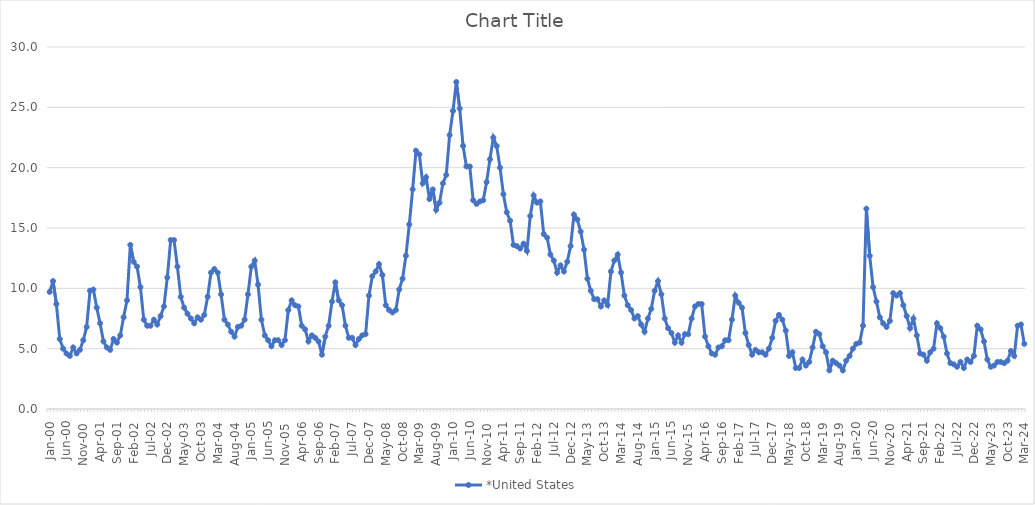
| Category | *United States | Alaska | Alabama | Arkansas | Arizona | California | Colorado | Connecticut | Delaware | Florida | Georgia | Hawaii | Iowa | Idaho | Illinois | Indiana | Kansas | Kentucky | Louisiana | Massachusetts | Maryland | Maine | Michigan | Minnesota | Missouri | Mississippi | Montana | North Carolina | North Dakota | Nebraska | New Hampshire | New Jersey | New Mexico | Nevada | New York | Ohio | Oklahoma | Oregon | Pennsylvania | Rhode Island | South Carolina | South Dakota | Tennessee | Texas | Utah | Virginia | Vermont | Washington | Wisconsin | West Virginia | Wyoming |
|---|---|---|---|---|---|---|---|---|---|---|---|---|---|---|---|---|---|---|---|---|---|---|---|---|---|---|---|---|---|---|---|---|---|---|---|---|---|---|---|---|---|---|---|---|---|---|---|---|---|---|---|
| Jan-00 | 9.7 |  |  |  |  |  |  |  |  |  |  |  |  |  |  |  |  |  |  |  |  |  |  |  |  |  |  |  |  |  |  |  |  |  |  |  |  |  |  |  |  |  |  |  |  |  |  |  |  |  |  |
| Feb-00 | 10.6 |  |  |  |  |  |  |  |  |  |  |  |  |  |  |  |  |  |  |  |  |  |  |  |  |  |  |  |  |  |  |  |  |  |  |  |  |  |  |  |  |  |  |  |  |  |  |  |  |  |  |
| Mar-00 | 8.7 |  |  |  |  |  |  |  |  |  |  |  |  |  |  |  |  |  |  |  |  |  |  |  |  |  |  |  |  |  |  |  |  |  |  |  |  |  |  |  |  |  |  |  |  |  |  |  |  |  |  |
| Apr-00 | 5.8 |  |  |  |  |  |  |  |  |  |  |  |  |  |  |  |  |  |  |  |  |  |  |  |  |  |  |  |  |  |  |  |  |  |  |  |  |  |  |  |  |  |  |  |  |  |  |  |  |  |  |
| May-00 | 5 |  |  |  |  |  |  |  |  |  |  |  |  |  |  |  |  |  |  |  |  |  |  |  |  |  |  |  |  |  |  |  |  |  |  |  |  |  |  |  |  |  |  |  |  |  |  |  |  |  |  |
| Jun-00 | 4.6 |  |  |  |  |  |  |  |  |  |  |  |  |  |  |  |  |  |  |  |  |  |  |  |  |  |  |  |  |  |  |  |  |  |  |  |  |  |  |  |  |  |  |  |  |  |  |  |  |  |  |
| Jul-00 | 4.4 |  |  |  |  |  |  |  |  |  |  |  |  |  |  |  |  |  |  |  |  |  |  |  |  |  |  |  |  |  |  |  |  |  |  |  |  |  |  |  |  |  |  |  |  |  |  |  |  |  |  |
| Aug-00 | 5.1 |  |  |  |  |  |  |  |  |  |  |  |  |  |  |  |  |  |  |  |  |  |  |  |  |  |  |  |  |  |  |  |  |  |  |  |  |  |  |  |  |  |  |  |  |  |  |  |  |  |  |
| Sep-00 | 4.6 |  |  |  |  |  |  |  |  |  |  |  |  |  |  |  |  |  |  |  |  |  |  |  |  |  |  |  |  |  |  |  |  |  |  |  |  |  |  |  |  |  |  |  |  |  |  |  |  |  |  |
| Oct-00 | 4.9 |  |  |  |  |  |  |  |  |  |  |  |  |  |  |  |  |  |  |  |  |  |  |  |  |  |  |  |  |  |  |  |  |  |  |  |  |  |  |  |  |  |  |  |  |  |  |  |  |  |  |
| Nov-00 | 5.7 |  |  |  |  |  |  |  |  |  |  |  |  |  |  |  |  |  |  |  |  |  |  |  |  |  |  |  |  |  |  |  |  |  |  |  |  |  |  |  |  |  |  |  |  |  |  |  |  |  |  |
| Dec-00 | 6.8 |  |  |  |  |  |  |  |  |  |  |  |  |  |  |  |  |  |  |  |  |  |  |  |  |  |  |  |  |  |  |  |  |  |  |  |  |  |  |  |  |  |  |  |  |  |  |  |  |  |  |
| Jan-01 | 9.8 |  |  |  |  |  |  |  |  |  |  |  |  |  |  |  |  |  |  |  |  |  |  |  |  |  |  |  |  |  |  |  |  |  |  |  |  |  |  |  |  |  |  |  |  |  |  |  |  |  |  |
| Feb-01 | 9.9 |  |  |  |  |  |  |  |  |  |  |  |  |  |  |  |  |  |  |  |  |  |  |  |  |  |  |  |  |  |  |  |  |  |  |  |  |  |  |  |  |  |  |  |  |  |  |  |  |  |  |
| Mar-01 | 8.4 |  |  |  |  |  |  |  |  |  |  |  |  |  |  |  |  |  |  |  |  |  |  |  |  |  |  |  |  |  |  |  |  |  |  |  |  |  |  |  |  |  |  |  |  |  |  |  |  |  |  |
| Apr-01 | 7.1 |  |  |  |  |  |  |  |  |  |  |  |  |  |  |  |  |  |  |  |  |  |  |  |  |  |  |  |  |  |  |  |  |  |  |  |  |  |  |  |  |  |  |  |  |  |  |  |  |  |  |
| May-01 | 5.6 |  |  |  |  |  |  |  |  |  |  |  |  |  |  |  |  |  |  |  |  |  |  |  |  |  |  |  |  |  |  |  |  |  |  |  |  |  |  |  |  |  |  |  |  |  |  |  |  |  |  |
| Jun-01 | 5.1 |  |  |  |  |  |  |  |  |  |  |  |  |  |  |  |  |  |  |  |  |  |  |  |  |  |  |  |  |  |  |  |  |  |  |  |  |  |  |  |  |  |  |  |  |  |  |  |  |  |  |
| Jul-01 | 4.9 |  |  |  |  |  |  |  |  |  |  |  |  |  |  |  |  |  |  |  |  |  |  |  |  |  |  |  |  |  |  |  |  |  |  |  |  |  |  |  |  |  |  |  |  |  |  |  |  |  |  |
| Aug-01 | 5.8 |  |  |  |  |  |  |  |  |  |  |  |  |  |  |  |  |  |  |  |  |  |  |  |  |  |  |  |  |  |  |  |  |  |  |  |  |  |  |  |  |  |  |  |  |  |  |  |  |  |  |
| Sep-01 | 5.5 |  |  |  |  |  |  |  |  |  |  |  |  |  |  |  |  |  |  |  |  |  |  |  |  |  |  |  |  |  |  |  |  |  |  |  |  |  |  |  |  |  |  |  |  |  |  |  |  |  |  |
| Oct-01 | 6.1 |  |  |  |  |  |  |  |  |  |  |  |  |  |  |  |  |  |  |  |  |  |  |  |  |  |  |  |  |  |  |  |  |  |  |  |  |  |  |  |  |  |  |  |  |  |  |  |  |  |  |
| Nov-01 | 7.6 |  |  |  |  |  |  |  |  |  |  |  |  |  |  |  |  |  |  |  |  |  |  |  |  |  |  |  |  |  |  |  |  |  |  |  |  |  |  |  |  |  |  |  |  |  |  |  |  |  |  |
| Dec-01 | 9 |  |  |  |  |  |  |  |  |  |  |  |  |  |  |  |  |  |  |  |  |  |  |  |  |  |  |  |  |  |  |  |  |  |  |  |  |  |  |  |  |  |  |  |  |  |  |  |  |  |  |
| Jan-02 | 13.6 |  |  |  |  |  |  |  |  |  |  |  |  |  |  |  |  |  |  |  |  |  |  |  |  |  |  |  |  |  |  |  |  |  |  |  |  |  |  |  |  |  |  |  |  |  |  |  |  |  |  |
| Feb-02 | 12.2 |  |  |  |  |  |  |  |  |  |  |  |  |  |  |  |  |  |  |  |  |  |  |  |  |  |  |  |  |  |  |  |  |  |  |  |  |  |  |  |  |  |  |  |  |  |  |  |  |  |  |
| Mar-02 | 11.8 |  |  |  |  |  |  |  |  |  |  |  |  |  |  |  |  |  |  |  |  |  |  |  |  |  |  |  |  |  |  |  |  |  |  |  |  |  |  |  |  |  |  |  |  |  |  |  |  |  |  |
| Apr-02 | 10.1 |  |  |  |  |  |  |  |  |  |  |  |  |  |  |  |  |  |  |  |  |  |  |  |  |  |  |  |  |  |  |  |  |  |  |  |  |  |  |  |  |  |  |  |  |  |  |  |  |  |  |
| May-02 | 7.4 |  |  |  |  |  |  |  |  |  |  |  |  |  |  |  |  |  |  |  |  |  |  |  |  |  |  |  |  |  |  |  |  |  |  |  |  |  |  |  |  |  |  |  |  |  |  |  |  |  |  |
| Jun-02 | 6.9 |  |  |  |  |  |  |  |  |  |  |  |  |  |  |  |  |  |  |  |  |  |  |  |  |  |  |  |  |  |  |  |  |  |  |  |  |  |  |  |  |  |  |  |  |  |  |  |  |  |  |
| Jul-02 | 6.9 |  |  |  |  |  |  |  |  |  |  |  |  |  |  |  |  |  |  |  |  |  |  |  |  |  |  |  |  |  |  |  |  |  |  |  |  |  |  |  |  |  |  |  |  |  |  |  |  |  |  |
| Aug-02 | 7.4 |  |  |  |  |  |  |  |  |  |  |  |  |  |  |  |  |  |  |  |  |  |  |  |  |  |  |  |  |  |  |  |  |  |  |  |  |  |  |  |  |  |  |  |  |  |  |  |  |  |  |
| Sep-02 | 7 |  |  |  |  |  |  |  |  |  |  |  |  |  |  |  |  |  |  |  |  |  |  |  |  |  |  |  |  |  |  |  |  |  |  |  |  |  |  |  |  |  |  |  |  |  |  |  |  |  |  |
| Oct-02 | 7.7 |  |  |  |  |  |  |  |  |  |  |  |  |  |  |  |  |  |  |  |  |  |  |  |  |  |  |  |  |  |  |  |  |  |  |  |  |  |  |  |  |  |  |  |  |  |  |  |  |  |  |
| Nov-02 | 8.5 |  |  |  |  |  |  |  |  |  |  |  |  |  |  |  |  |  |  |  |  |  |  |  |  |  |  |  |  |  |  |  |  |  |  |  |  |  |  |  |  |  |  |  |  |  |  |  |  |  |  |
| Dec-02 | 10.9 |  |  |  |  |  |  |  |  |  |  |  |  |  |  |  |  |  |  |  |  |  |  |  |  |  |  |  |  |  |  |  |  |  |  |  |  |  |  |  |  |  |  |  |  |  |  |  |  |  |  |
| Jan-03 | 14 |  |  |  |  |  |  |  |  |  |  |  |  |  |  |  |  |  |  |  |  |  |  |  |  |  |  |  |  |  |  |  |  |  |  |  |  |  |  |  |  |  |  |  |  |  |  |  |  |  |  |
| Feb-03 | 14 |  |  |  |  |  |  |  |  |  |  |  |  |  |  |  |  |  |  |  |  |  |  |  |  |  |  |  |  |  |  |  |  |  |  |  |  |  |  |  |  |  |  |  |  |  |  |  |  |  |  |
| Mar-03 | 11.8 |  |  |  |  |  |  |  |  |  |  |  |  |  |  |  |  |  |  |  |  |  |  |  |  |  |  |  |  |  |  |  |  |  |  |  |  |  |  |  |  |  |  |  |  |  |  |  |  |  |  |
| Apr-03 | 9.3 |  |  |  |  |  |  |  |  |  |  |  |  |  |  |  |  |  |  |  |  |  |  |  |  |  |  |  |  |  |  |  |  |  |  |  |  |  |  |  |  |  |  |  |  |  |  |  |  |  |  |
| May-03 | 8.4 |  |  |  |  |  |  |  |  |  |  |  |  |  |  |  |  |  |  |  |  |  |  |  |  |  |  |  |  |  |  |  |  |  |  |  |  |  |  |  |  |  |  |  |  |  |  |  |  |  |  |
| Jun-03 | 7.9 |  |  |  |  |  |  |  |  |  |  |  |  |  |  |  |  |  |  |  |  |  |  |  |  |  |  |  |  |  |  |  |  |  |  |  |  |  |  |  |  |  |  |  |  |  |  |  |  |  |  |
| Jul-03 | 7.5 |  |  |  |  |  |  |  |  |  |  |  |  |  |  |  |  |  |  |  |  |  |  |  |  |  |  |  |  |  |  |  |  |  |  |  |  |  |  |  |  |  |  |  |  |  |  |  |  |  |  |
| Aug-03 | 7.1 |  |  |  |  |  |  |  |  |  |  |  |  |  |  |  |  |  |  |  |  |  |  |  |  |  |  |  |  |  |  |  |  |  |  |  |  |  |  |  |  |  |  |  |  |  |  |  |  |  |  |
| Sep-03 | 7.6 |  |  |  |  |  |  |  |  |  |  |  |  |  |  |  |  |  |  |  |  |  |  |  |  |  |  |  |  |  |  |  |  |  |  |  |  |  |  |  |  |  |  |  |  |  |  |  |  |  |  |
| Oct-03 | 7.4 |  |  |  |  |  |  |  |  |  |  |  |  |  |  |  |  |  |  |  |  |  |  |  |  |  |  |  |  |  |  |  |  |  |  |  |  |  |  |  |  |  |  |  |  |  |  |  |  |  |  |
| Nov-03 | 7.8 |  |  |  |  |  |  |  |  |  |  |  |  |  |  |  |  |  |  |  |  |  |  |  |  |  |  |  |  |  |  |  |  |  |  |  |  |  |  |  |  |  |  |  |  |  |  |  |  |  |  |
| Dec-03 | 9.3 |  |  |  |  |  |  |  |  |  |  |  |  |  |  |  |  |  |  |  |  |  |  |  |  |  |  |  |  |  |  |  |  |  |  |  |  |  |  |  |  |  |  |  |  |  |  |  |  |  |  |
| Jan-04 | 11.3 |  |  |  |  |  |  |  |  |  |  |  |  |  |  |  |  |  |  |  |  |  |  |  |  |  |  |  |  |  |  |  |  |  |  |  |  |  |  |  |  |  |  |  |  |  |  |  |  |  |  |
| Feb-04 | 11.6 |  |  |  |  |  |  |  |  |  |  |  |  |  |  |  |  |  |  |  |  |  |  |  |  |  |  |  |  |  |  |  |  |  |  |  |  |  |  |  |  |  |  |  |  |  |  |  |  |  |  |
| Mar-04 | 11.3 |  |  |  |  |  |  |  |  |  |  |  |  |  |  |  |  |  |  |  |  |  |  |  |  |  |  |  |  |  |  |  |  |  |  |  |  |  |  |  |  |  |  |  |  |  |  |  |  |  |  |
| Apr-04 | 9.5 |  |  |  |  |  |  |  |  |  |  |  |  |  |  |  |  |  |  |  |  |  |  |  |  |  |  |  |  |  |  |  |  |  |  |  |  |  |  |  |  |  |  |  |  |  |  |  |  |  |  |
| May-04 | 7.4 |  |  |  |  |  |  |  |  |  |  |  |  |  |  |  |  |  |  |  |  |  |  |  |  |  |  |  |  |  |  |  |  |  |  |  |  |  |  |  |  |  |  |  |  |  |  |  |  |  |  |
| Jun-04 | 7 |  |  |  |  |  |  |  |  |  |  |  |  |  |  |  |  |  |  |  |  |  |  |  |  |  |  |  |  |  |  |  |  |  |  |  |  |  |  |  |  |  |  |  |  |  |  |  |  |  |  |
| Jul-04 | 6.4 |  |  |  |  |  |  |  |  |  |  |  |  |  |  |  |  |  |  |  |  |  |  |  |  |  |  |  |  |  |  |  |  |  |  |  |  |  |  |  |  |  |  |  |  |  |  |  |  |  |  |
| Aug-04 | 6 |  |  |  |  |  |  |  |  |  |  |  |  |  |  |  |  |  |  |  |  |  |  |  |  |  |  |  |  |  |  |  |  |  |  |  |  |  |  |  |  |  |  |  |  |  |  |  |  |  |  |
| Sep-04 | 6.8 |  |  |  |  |  |  |  |  |  |  |  |  |  |  |  |  |  |  |  |  |  |  |  |  |  |  |  |  |  |  |  |  |  |  |  |  |  |  |  |  |  |  |  |  |  |  |  |  |  |  |
| Oct-04 | 6.9 |  |  |  |  |  |  |  |  |  |  |  |  |  |  |  |  |  |  |  |  |  |  |  |  |  |  |  |  |  |  |  |  |  |  |  |  |  |  |  |  |  |  |  |  |  |  |  |  |  |  |
| Nov-04 | 7.4 |  |  |  |  |  |  |  |  |  |  |  |  |  |  |  |  |  |  |  |  |  |  |  |  |  |  |  |  |  |  |  |  |  |  |  |  |  |  |  |  |  |  |  |  |  |  |  |  |  |  |
| Dec-04 | 9.5 |  |  |  |  |  |  |  |  |  |  |  |  |  |  |  |  |  |  |  |  |  |  |  |  |  |  |  |  |  |  |  |  |  |  |  |  |  |  |  |  |  |  |  |  |  |  |  |  |  |  |
| Jan-05 | 11.8 |  |  |  |  |  |  |  |  |  |  |  |  |  |  |  |  |  |  |  |  |  |  |  |  |  |  |  |  |  |  |  |  |  |  |  |  |  |  |  |  |  |  |  |  |  |  |  |  |  |  |
| Feb-05 | 12.3 |  |  |  |  |  |  |  |  |  |  |  |  |  |  |  |  |  |  |  |  |  |  |  |  |  |  |  |  |  |  |  |  |  |  |  |  |  |  |  |  |  |  |  |  |  |  |  |  |  |  |
| Mar-05 | 10.3 |  |  |  |  |  |  |  |  |  |  |  |  |  |  |  |  |  |  |  |  |  |  |  |  |  |  |  |  |  |  |  |  |  |  |  |  |  |  |  |  |  |  |  |  |  |  |  |  |  |  |
| Apr-05 | 7.4 |  |  |  |  |  |  |  |  |  |  |  |  |  |  |  |  |  |  |  |  |  |  |  |  |  |  |  |  |  |  |  |  |  |  |  |  |  |  |  |  |  |  |  |  |  |  |  |  |  |  |
| May-05 | 6.1 |  |  |  |  |  |  |  |  |  |  |  |  |  |  |  |  |  |  |  |  |  |  |  |  |  |  |  |  |  |  |  |  |  |  |  |  |  |  |  |  |  |  |  |  |  |  |  |  |  |  |
| Jun-05 | 5.7 |  |  |  |  |  |  |  |  |  |  |  |  |  |  |  |  |  |  |  |  |  |  |  |  |  |  |  |  |  |  |  |  |  |  |  |  |  |  |  |  |  |  |  |  |  |  |  |  |  |  |
| Jul-05 | 5.2 |  |  |  |  |  |  |  |  |  |  |  |  |  |  |  |  |  |  |  |  |  |  |  |  |  |  |  |  |  |  |  |  |  |  |  |  |  |  |  |  |  |  |  |  |  |  |  |  |  |  |
| Aug-05 | 5.7 |  |  |  |  |  |  |  |  |  |  |  |  |  |  |  |  |  |  |  |  |  |  |  |  |  |  |  |  |  |  |  |  |  |  |  |  |  |  |  |  |  |  |  |  |  |  |  |  |  |  |
| Sep-05 | 5.7 |  |  |  |  |  |  |  |  |  |  |  |  |  |  |  |  |  |  |  |  |  |  |  |  |  |  |  |  |  |  |  |  |  |  |  |  |  |  |  |  |  |  |  |  |  |  |  |  |  |  |
| Oct-05 | 5.3 |  |  |  |  |  |  |  |  |  |  |  |  |  |  |  |  |  |  |  |  |  |  |  |  |  |  |  |  |  |  |  |  |  |  |  |  |  |  |  |  |  |  |  |  |  |  |  |  |  |  |
| Nov-05 | 5.7 |  |  |  |  |  |  |  |  |  |  |  |  |  |  |  |  |  |  |  |  |  |  |  |  |  |  |  |  |  |  |  |  |  |  |  |  |  |  |  |  |  |  |  |  |  |  |  |  |  |  |
| Dec-05 | 8.2 |  |  |  |  |  |  |  |  |  |  |  |  |  |  |  |  |  |  |  |  |  |  |  |  |  |  |  |  |  |  |  |  |  |  |  |  |  |  |  |  |  |  |  |  |  |  |  |  |  |  |
| Jan-06 | 9 |  |  |  |  |  |  |  |  |  |  |  |  |  |  |  |  |  |  |  |  |  |  |  |  |  |  |  |  |  |  |  |  |  |  |  |  |  |  |  |  |  |  |  |  |  |  |  |  |  |  |
| Feb-06 | 8.6 |  |  |  |  |  |  |  |  |  |  |  |  |  |  |  |  |  |  |  |  |  |  |  |  |  |  |  |  |  |  |  |  |  |  |  |  |  |  |  |  |  |  |  |  |  |  |  |  |  |  |
| Mar-06 | 8.5 |  |  |  |  |  |  |  |  |  |  |  |  |  |  |  |  |  |  |  |  |  |  |  |  |  |  |  |  |  |  |  |  |  |  |  |  |  |  |  |  |  |  |  |  |  |  |  |  |  |  |
| Apr-06 | 6.9 |  |  |  |  |  |  |  |  |  |  |  |  |  |  |  |  |  |  |  |  |  |  |  |  |  |  |  |  |  |  |  |  |  |  |  |  |  |  |  |  |  |  |  |  |  |  |  |  |  |  |
| May-06 | 6.6 |  |  |  |  |  |  |  |  |  |  |  |  |  |  |  |  |  |  |  |  |  |  |  |  |  |  |  |  |  |  |  |  |  |  |  |  |  |  |  |  |  |  |  |  |  |  |  |  |  |  |
| Jun-06 | 5.6 |  |  |  |  |  |  |  |  |  |  |  |  |  |  |  |  |  |  |  |  |  |  |  |  |  |  |  |  |  |  |  |  |  |  |  |  |  |  |  |  |  |  |  |  |  |  |  |  |  |  |
| Jul-06 | 6.1 |  |  |  |  |  |  |  |  |  |  |  |  |  |  |  |  |  |  |  |  |  |  |  |  |  |  |  |  |  |  |  |  |  |  |  |  |  |  |  |  |  |  |  |  |  |  |  |  |  |  |
| Aug-06 | 5.9 |  |  |  |  |  |  |  |  |  |  |  |  |  |  |  |  |  |  |  |  |  |  |  |  |  |  |  |  |  |  |  |  |  |  |  |  |  |  |  |  |  |  |  |  |  |  |  |  |  |  |
| Sep-06 | 5.6 |  |  |  |  |  |  |  |  |  |  |  |  |  |  |  |  |  |  |  |  |  |  |  |  |  |  |  |  |  |  |  |  |  |  |  |  |  |  |  |  |  |  |  |  |  |  |  |  |  |  |
| Oct-06 | 4.5 |  |  |  |  |  |  |  |  |  |  |  |  |  |  |  |  |  |  |  |  |  |  |  |  |  |  |  |  |  |  |  |  |  |  |  |  |  |  |  |  |  |  |  |  |  |  |  |  |  |  |
| Nov-06 | 6 |  |  |  |  |  |  |  |  |  |  |  |  |  |  |  |  |  |  |  |  |  |  |  |  |  |  |  |  |  |  |  |  |  |  |  |  |  |  |  |  |  |  |  |  |  |  |  |  |  |  |
| Dec-06 | 6.9 |  |  |  |  |  |  |  |  |  |  |  |  |  |  |  |  |  |  |  |  |  |  |  |  |  |  |  |  |  |  |  |  |  |  |  |  |  |  |  |  |  |  |  |  |  |  |  |  |  |  |
| Jan-07 | 8.9 |  |  |  |  |  |  |  |  |  |  |  |  |  |  |  |  |  |  |  |  |  |  |  |  |  |  |  |  |  |  |  |  |  |  |  |  |  |  |  |  |  |  |  |  |  |  |  |  |  |  |
| Feb-07 | 10.5 |  |  |  |  |  |  |  |  |  |  |  |  |  |  |  |  |  |  |  |  |  |  |  |  |  |  |  |  |  |  |  |  |  |  |  |  |  |  |  |  |  |  |  |  |  |  |  |  |  |  |
| Mar-07 | 9 |  |  |  |  |  |  |  |  |  |  |  |  |  |  |  |  |  |  |  |  |  |  |  |  |  |  |  |  |  |  |  |  |  |  |  |  |  |  |  |  |  |  |  |  |  |  |  |  |  |  |
| Apr-07 | 8.6 |  |  |  |  |  |  |  |  |  |  |  |  |  |  |  |  |  |  |  |  |  |  |  |  |  |  |  |  |  |  |  |  |  |  |  |  |  |  |  |  |  |  |  |  |  |  |  |  |  |  |
| May-07 | 6.9 |  |  |  |  |  |  |  |  |  |  |  |  |  |  |  |  |  |  |  |  |  |  |  |  |  |  |  |  |  |  |  |  |  |  |  |  |  |  |  |  |  |  |  |  |  |  |  |  |  |  |
| Jun-07 | 5.9 |  |  |  |  |  |  |  |  |  |  |  |  |  |  |  |  |  |  |  |  |  |  |  |  |  |  |  |  |  |  |  |  |  |  |  |  |  |  |  |  |  |  |  |  |  |  |  |  |  |  |
| Jul-07 | 5.9 |  |  |  |  |  |  |  |  |  |  |  |  |  |  |  |  |  |  |  |  |  |  |  |  |  |  |  |  |  |  |  |  |  |  |  |  |  |  |  |  |  |  |  |  |  |  |  |  |  |  |
| Aug-07 | 5.3 |  |  |  |  |  |  |  |  |  |  |  |  |  |  |  |  |  |  |  |  |  |  |  |  |  |  |  |  |  |  |  |  |  |  |  |  |  |  |  |  |  |  |  |  |  |  |  |  |  |  |
| Sep-07 | 5.8 |  |  |  |  |  |  |  |  |  |  |  |  |  |  |  |  |  |  |  |  |  |  |  |  |  |  |  |  |  |  |  |  |  |  |  |  |  |  |  |  |  |  |  |  |  |  |  |  |  |  |
| Oct-07 | 6.1 |  |  |  |  |  |  |  |  |  |  |  |  |  |  |  |  |  |  |  |  |  |  |  |  |  |  |  |  |  |  |  |  |  |  |  |  |  |  |  |  |  |  |  |  |  |  |  |  |  |  |
| Nov-07 | 6.2 |  |  |  |  |  |  |  |  |  |  |  |  |  |  |  |  |  |  |  |  |  |  |  |  |  |  |  |  |  |  |  |  |  |  |  |  |  |  |  |  |  |  |  |  |  |  |  |  |  |  |
| Dec-07 | 9.4 |  |  |  |  |  |  |  |  |  |  |  |  |  |  |  |  |  |  |  |  |  |  |  |  |  |  |  |  |  |  |  |  |  |  |  |  |  |  |  |  |  |  |  |  |  |  |  |  |  |  |
| Jan-08 | 11 |  |  |  |  |  |  |  |  |  |  |  |  |  |  |  |  |  |  |  |  |  |  |  |  |  |  |  |  |  |  |  |  |  |  |  |  |  |  |  |  |  |  |  |  |  |  |  |  |  |  |
| Feb-08 | 11.4 |  |  |  |  |  |  |  |  |  |  |  |  |  |  |  |  |  |  |  |  |  |  |  |  |  |  |  |  |  |  |  |  |  |  |  |  |  |  |  |  |  |  |  |  |  |  |  |  |  |  |
| Mar-08 | 12 |  |  |  |  |  |  |  |  |  |  |  |  |  |  |  |  |  |  |  |  |  |  |  |  |  |  |  |  |  |  |  |  |  |  |  |  |  |  |  |  |  |  |  |  |  |  |  |  |  |  |
| Apr-08 | 11.1 |  |  |  |  |  |  |  |  |  |  |  |  |  |  |  |  |  |  |  |  |  |  |  |  |  |  |  |  |  |  |  |  |  |  |  |  |  |  |  |  |  |  |  |  |  |  |  |  |  |  |
| May-08 | 8.6 |  |  |  |  |  |  |  |  |  |  |  |  |  |  |  |  |  |  |  |  |  |  |  |  |  |  |  |  |  |  |  |  |  |  |  |  |  |  |  |  |  |  |  |  |  |  |  |  |  |  |
| Jun-08 | 8.2 |  |  |  |  |  |  |  |  |  |  |  |  |  |  |  |  |  |  |  |  |  |  |  |  |  |  |  |  |  |  |  |  |  |  |  |  |  |  |  |  |  |  |  |  |  |  |  |  |  |  |
| Jul-08 | 8 |  |  |  |  |  |  |  |  |  |  |  |  |  |  |  |  |  |  |  |  |  |  |  |  |  |  |  |  |  |  |  |  |  |  |  |  |  |  |  |  |  |  |  |  |  |  |  |  |  |  |
| Aug-08 | 8.2 |  |  |  |  |  |  |  |  |  |  |  |  |  |  |  |  |  |  |  |  |  |  |  |  |  |  |  |  |  |  |  |  |  |  |  |  |  |  |  |  |  |  |  |  |  |  |  |  |  |  |
| Sep-08 | 9.9 |  |  |  |  |  |  |  |  |  |  |  |  |  |  |  |  |  |  |  |  |  |  |  |  |  |  |  |  |  |  |  |  |  |  |  |  |  |  |  |  |  |  |  |  |  |  |  |  |  |  |
| Oct-08 | 10.8 |  |  |  |  |  |  |  |  |  |  |  |  |  |  |  |  |  |  |  |  |  |  |  |  |  |  |  |  |  |  |  |  |  |  |  |  |  |  |  |  |  |  |  |  |  |  |  |  |  |  |
| Nov-08 | 12.7 |  |  |  |  |  |  |  |  |  |  |  |  |  |  |  |  |  |  |  |  |  |  |  |  |  |  |  |  |  |  |  |  |  |  |  |  |  |  |  |  |  |  |  |  |  |  |  |  |  |  |
| Dec-08 | 15.3 |  |  |  |  |  |  |  |  |  |  |  |  |  |  |  |  |  |  |  |  |  |  |  |  |  |  |  |  |  |  |  |  |  |  |  |  |  |  |  |  |  |  |  |  |  |  |  |  |  |  |
| Jan-09 | 18.2 |  |  |  |  |  |  |  |  |  |  |  |  |  |  |  |  |  |  |  |  |  |  |  |  |  |  |  |  |  |  |  |  |  |  |  |  |  |  |  |  |  |  |  |  |  |  |  |  |  |  |
| Feb-09 | 21.4 |  |  |  |  |  |  |  |  |  |  |  |  |  |  |  |  |  |  |  |  |  |  |  |  |  |  |  |  |  |  |  |  |  |  |  |  |  |  |  |  |  |  |  |  |  |  |  |  |  |  |
| Mar-09 | 21.1 |  |  |  |  |  |  |  |  |  |  |  |  |  |  |  |  |  |  |  |  |  |  |  |  |  |  |  |  |  |  |  |  |  |  |  |  |  |  |  |  |  |  |  |  |  |  |  |  |  |  |
| Apr-09 | 18.7 |  |  |  |  |  |  |  |  |  |  |  |  |  |  |  |  |  |  |  |  |  |  |  |  |  |  |  |  |  |  |  |  |  |  |  |  |  |  |  |  |  |  |  |  |  |  |  |  |  |  |
| May-09 | 19.2 |  |  |  |  |  |  |  |  |  |  |  |  |  |  |  |  |  |  |  |  |  |  |  |  |  |  |  |  |  |  |  |  |  |  |  |  |  |  |  |  |  |  |  |  |  |  |  |  |  |  |
| Jun-09 | 17.4 |  |  |  |  |  |  |  |  |  |  |  |  |  |  |  |  |  |  |  |  |  |  |  |  |  |  |  |  |  |  |  |  |  |  |  |  |  |  |  |  |  |  |  |  |  |  |  |  |  |  |
| Jul-09 | 18.2 |  |  |  |  |  |  |  |  |  |  |  |  |  |  |  |  |  |  |  |  |  |  |  |  |  |  |  |  |  |  |  |  |  |  |  |  |  |  |  |  |  |  |  |  |  |  |  |  |  |  |
| Aug-09 | 16.5 |  |  |  |  |  |  |  |  |  |  |  |  |  |  |  |  |  |  |  |  |  |  |  |  |  |  |  |  |  |  |  |  |  |  |  |  |  |  |  |  |  |  |  |  |  |  |  |  |  |  |
| Sep-09 | 17.1 |  |  |  |  |  |  |  |  |  |  |  |  |  |  |  |  |  |  |  |  |  |  |  |  |  |  |  |  |  |  |  |  |  |  |  |  |  |  |  |  |  |  |  |  |  |  |  |  |  |  |
| Oct-09 | 18.7 |  |  |  |  |  |  |  |  |  |  |  |  |  |  |  |  |  |  |  |  |  |  |  |  |  |  |  |  |  |  |  |  |  |  |  |  |  |  |  |  |  |  |  |  |  |  |  |  |  |  |
| Nov-09 | 19.4 |  |  |  |  |  |  |  |  |  |  |  |  |  |  |  |  |  |  |  |  |  |  |  |  |  |  |  |  |  |  |  |  |  |  |  |  |  |  |  |  |  |  |  |  |  |  |  |  |  |  |
| Dec-09 | 22.7 |  |  |  |  |  |  |  |  |  |  |  |  |  |  |  |  |  |  |  |  |  |  |  |  |  |  |  |  |  |  |  |  |  |  |  |  |  |  |  |  |  |  |  |  |  |  |  |  |  |  |
| Jan-10 | 24.7 |  |  |  |  |  |  |  |  |  |  |  |  |  |  |  |  |  |  |  |  |  |  |  |  |  |  |  |  |  |  |  |  |  |  |  |  |  |  |  |  |  |  |  |  |  |  |  |  |  |  |
| Feb-10 | 27.1 |  |  |  |  |  |  |  |  |  |  |  |  |  |  |  |  |  |  |  |  |  |  |  |  |  |  |  |  |  |  |  |  |  |  |  |  |  |  |  |  |  |  |  |  |  |  |  |  |  |  |
| Mar-10 | 24.9 |  |  |  |  |  |  |  |  |  |  |  |  |  |  |  |  |  |  |  |  |  |  |  |  |  |  |  |  |  |  |  |  |  |  |  |  |  |  |  |  |  |  |  |  |  |  |  |  |  |  |
| Apr-10 | 21.8 |  |  |  |  |  |  |  |  |  |  |  |  |  |  |  |  |  |  |  |  |  |  |  |  |  |  |  |  |  |  |  |  |  |  |  |  |  |  |  |  |  |  |  |  |  |  |  |  |  |  |
| May-10 | 20.1 |  |  |  |  |  |  |  |  |  |  |  |  |  |  |  |  |  |  |  |  |  |  |  |  |  |  |  |  |  |  |  |  |  |  |  |  |  |  |  |  |  |  |  |  |  |  |  |  |  |  |
| Jun-10 | 20.1 |  |  |  |  |  |  |  |  |  |  |  |  |  |  |  |  |  |  |  |  |  |  |  |  |  |  |  |  |  |  |  |  |  |  |  |  |  |  |  |  |  |  |  |  |  |  |  |  |  |  |
| Jul-10 | 17.3 |  |  |  |  |  |  |  |  |  |  |  |  |  |  |  |  |  |  |  |  |  |  |  |  |  |  |  |  |  |  |  |  |  |  |  |  |  |  |  |  |  |  |  |  |  |  |  |  |  |  |
| Aug-10 | 17 |  |  |  |  |  |  |  |  |  |  |  |  |  |  |  |  |  |  |  |  |  |  |  |  |  |  |  |  |  |  |  |  |  |  |  |  |  |  |  |  |  |  |  |  |  |  |  |  |  |  |
| Sep-10 | 17.2 |  |  |  |  |  |  |  |  |  |  |  |  |  |  |  |  |  |  |  |  |  |  |  |  |  |  |  |  |  |  |  |  |  |  |  |  |  |  |  |  |  |  |  |  |  |  |  |  |  |  |
| Oct-10 | 17.3 |  |  |  |  |  |  |  |  |  |  |  |  |  |  |  |  |  |  |  |  |  |  |  |  |  |  |  |  |  |  |  |  |  |  |  |  |  |  |  |  |  |  |  |  |  |  |  |  |  |  |
| Nov-10 | 18.8 |  |  |  |  |  |  |  |  |  |  |  |  |  |  |  |  |  |  |  |  |  |  |  |  |  |  |  |  |  |  |  |  |  |  |  |  |  |  |  |  |  |  |  |  |  |  |  |  |  |  |
| Dec-10 | 20.7 |  |  |  |  |  |  |  |  |  |  |  |  |  |  |  |  |  |  |  |  |  |  |  |  |  |  |  |  |  |  |  |  |  |  |  |  |  |  |  |  |  |  |  |  |  |  |  |  |  |  |
| Jan-11 | 22.5 |  |  |  |  |  |  |  |  |  |  |  |  |  |  |  |  |  |  |  |  |  |  |  |  |  |  |  |  |  |  |  |  |  |  |  |  |  |  |  |  |  |  |  |  |  |  |  |  |  |  |
| Feb-11 | 21.8 |  |  |  |  |  |  |  |  |  |  |  |  |  |  |  |  |  |  |  |  |  |  |  |  |  |  |  |  |  |  |  |  |  |  |  |  |  |  |  |  |  |  |  |  |  |  |  |  |  |  |
| Mar-11 | 20 |  |  |  |  |  |  |  |  |  |  |  |  |  |  |  |  |  |  |  |  |  |  |  |  |  |  |  |  |  |  |  |  |  |  |  |  |  |  |  |  |  |  |  |  |  |  |  |  |  |  |
| Apr-11 | 17.8 |  |  |  |  |  |  |  |  |  |  |  |  |  |  |  |  |  |  |  |  |  |  |  |  |  |  |  |  |  |  |  |  |  |  |  |  |  |  |  |  |  |  |  |  |  |  |  |  |  |  |
| May-11 | 16.3 |  |  |  |  |  |  |  |  |  |  |  |  |  |  |  |  |  |  |  |  |  |  |  |  |  |  |  |  |  |  |  |  |  |  |  |  |  |  |  |  |  |  |  |  |  |  |  |  |  |  |
| Jun-11 | 15.6 |  |  |  |  |  |  |  |  |  |  |  |  |  |  |  |  |  |  |  |  |  |  |  |  |  |  |  |  |  |  |  |  |  |  |  |  |  |  |  |  |  |  |  |  |  |  |  |  |  |  |
| Jul-11 | 13.6 |  |  |  |  |  |  |  |  |  |  |  |  |  |  |  |  |  |  |  |  |  |  |  |  |  |  |  |  |  |  |  |  |  |  |  |  |  |  |  |  |  |  |  |  |  |  |  |  |  |  |
| Aug-11 | 13.5 |  |  |  |  |  |  |  |  |  |  |  |  |  |  |  |  |  |  |  |  |  |  |  |  |  |  |  |  |  |  |  |  |  |  |  |  |  |  |  |  |  |  |  |  |  |  |  |  |  |  |
| Sep-11 | 13.3 |  |  |  |  |  |  |  |  |  |  |  |  |  |  |  |  |  |  |  |  |  |  |  |  |  |  |  |  |  |  |  |  |  |  |  |  |  |  |  |  |  |  |  |  |  |  |  |  |  |  |
| Oct-11 | 13.7 |  |  |  |  |  |  |  |  |  |  |  |  |  |  |  |  |  |  |  |  |  |  |  |  |  |  |  |  |  |  |  |  |  |  |  |  |  |  |  |  |  |  |  |  |  |  |  |  |  |  |
| Nov-11 | 13.1 |  |  |  |  |  |  |  |  |  |  |  |  |  |  |  |  |  |  |  |  |  |  |  |  |  |  |  |  |  |  |  |  |  |  |  |  |  |  |  |  |  |  |  |  |  |  |  |  |  |  |
| Dec-11 | 16 |  |  |  |  |  |  |  |  |  |  |  |  |  |  |  |  |  |  |  |  |  |  |  |  |  |  |  |  |  |  |  |  |  |  |  |  |  |  |  |  |  |  |  |  |  |  |  |  |  |  |
| Jan-12 | 17.7 |  |  |  |  |  |  |  |  |  |  |  |  |  |  |  |  |  |  |  |  |  |  |  |  |  |  |  |  |  |  |  |  |  |  |  |  |  |  |  |  |  |  |  |  |  |  |  |  |  |  |
| Feb-12 | 17.1 |  |  |  |  |  |  |  |  |  |  |  |  |  |  |  |  |  |  |  |  |  |  |  |  |  |  |  |  |  |  |  |  |  |  |  |  |  |  |  |  |  |  |  |  |  |  |  |  |  |  |
| Mar-12 | 17.2 |  |  |  |  |  |  |  |  |  |  |  |  |  |  |  |  |  |  |  |  |  |  |  |  |  |  |  |  |  |  |  |  |  |  |  |  |  |  |  |  |  |  |  |  |  |  |  |  |  |  |
| Apr-12 | 14.5 |  |  |  |  |  |  |  |  |  |  |  |  |  |  |  |  |  |  |  |  |  |  |  |  |  |  |  |  |  |  |  |  |  |  |  |  |  |  |  |  |  |  |  |  |  |  |  |  |  |  |
| May-12 | 14.2 |  |  |  |  |  |  |  |  |  |  |  |  |  |  |  |  |  |  |  |  |  |  |  |  |  |  |  |  |  |  |  |  |  |  |  |  |  |  |  |  |  |  |  |  |  |  |  |  |  |  |
| Jun-12 | 12.8 |  |  |  |  |  |  |  |  |  |  |  |  |  |  |  |  |  |  |  |  |  |  |  |  |  |  |  |  |  |  |  |  |  |  |  |  |  |  |  |  |  |  |  |  |  |  |  |  |  |  |
| Jul-12 | 12.3 |  |  |  |  |  |  |  |  |  |  |  |  |  |  |  |  |  |  |  |  |  |  |  |  |  |  |  |  |  |  |  |  |  |  |  |  |  |  |  |  |  |  |  |  |  |  |  |  |  |  |
| Aug-12 | 11.3 |  |  |  |  |  |  |  |  |  |  |  |  |  |  |  |  |  |  |  |  |  |  |  |  |  |  |  |  |  |  |  |  |  |  |  |  |  |  |  |  |  |  |  |  |  |  |  |  |  |  |
| Sep-12 | 11.9 |  |  |  |  |  |  |  |  |  |  |  |  |  |  |  |  |  |  |  |  |  |  |  |  |  |  |  |  |  |  |  |  |  |  |  |  |  |  |  |  |  |  |  |  |  |  |  |  |  |  |
| Oct-12 | 11.4 |  |  |  |  |  |  |  |  |  |  |  |  |  |  |  |  |  |  |  |  |  |  |  |  |  |  |  |  |  |  |  |  |  |  |  |  |  |  |  |  |  |  |  |  |  |  |  |  |  |  |
| Nov-12 | 12.2 |  |  |  |  |  |  |  |  |  |  |  |  |  |  |  |  |  |  |  |  |  |  |  |  |  |  |  |  |  |  |  |  |  |  |  |  |  |  |  |  |  |  |  |  |  |  |  |  |  |  |
| Dec-12 | 13.5 |  |  |  |  |  |  |  |  |  |  |  |  |  |  |  |  |  |  |  |  |  |  |  |  |  |  |  |  |  |  |  |  |  |  |  |  |  |  |  |  |  |  |  |  |  |  |  |  |  |  |
| Jan-13 | 16.1 |  |  |  |  |  |  |  |  |  |  |  |  |  |  |  |  |  |  |  |  |  |  |  |  |  |  |  |  |  |  |  |  |  |  |  |  |  |  |  |  |  |  |  |  |  |  |  |  |  |  |
| Feb-13 | 15.7 |  |  |  |  |  |  |  |  |  |  |  |  |  |  |  |  |  |  |  |  |  |  |  |  |  |  |  |  |  |  |  |  |  |  |  |  |  |  |  |  |  |  |  |  |  |  |  |  |  |  |
| Mar-13 | 14.7 |  |  |  |  |  |  |  |  |  |  |  |  |  |  |  |  |  |  |  |  |  |  |  |  |  |  |  |  |  |  |  |  |  |  |  |  |  |  |  |  |  |  |  |  |  |  |  |  |  |  |
| Apr-13 | 13.2 |  |  |  |  |  |  |  |  |  |  |  |  |  |  |  |  |  |  |  |  |  |  |  |  |  |  |  |  |  |  |  |  |  |  |  |  |  |  |  |  |  |  |  |  |  |  |  |  |  |  |
| May-13 | 10.8 |  |  |  |  |  |  |  |  |  |  |  |  |  |  |  |  |  |  |  |  |  |  |  |  |  |  |  |  |  |  |  |  |  |  |  |  |  |  |  |  |  |  |  |  |  |  |  |  |  |  |
| Jun-13 | 9.8 |  |  |  |  |  |  |  |  |  |  |  |  |  |  |  |  |  |  |  |  |  |  |  |  |  |  |  |  |  |  |  |  |  |  |  |  |  |  |  |  |  |  |  |  |  |  |  |  |  |  |
| Jul-13 | 9.1 |  |  |  |  |  |  |  |  |  |  |  |  |  |  |  |  |  |  |  |  |  |  |  |  |  |  |  |  |  |  |  |  |  |  |  |  |  |  |  |  |  |  |  |  |  |  |  |  |  |  |
| Aug-13 | 9.1 |  |  |  |  |  |  |  |  |  |  |  |  |  |  |  |  |  |  |  |  |  |  |  |  |  |  |  |  |  |  |  |  |  |  |  |  |  |  |  |  |  |  |  |  |  |  |  |  |  |  |
| Sep-13 | 8.5 |  |  |  |  |  |  |  |  |  |  |  |  |  |  |  |  |  |  |  |  |  |  |  |  |  |  |  |  |  |  |  |  |  |  |  |  |  |  |  |  |  |  |  |  |  |  |  |  |  |  |
| Oct-13 | 9 |  |  |  |  |  |  |  |  |  |  |  |  |  |  |  |  |  |  |  |  |  |  |  |  |  |  |  |  |  |  |  |  |  |  |  |  |  |  |  |  |  |  |  |  |  |  |  |  |  |  |
| Nov-13 | 8.6 |  |  |  |  |  |  |  |  |  |  |  |  |  |  |  |  |  |  |  |  |  |  |  |  |  |  |  |  |  |  |  |  |  |  |  |  |  |  |  |  |  |  |  |  |  |  |  |  |  |  |
| Dec-13 | 11.4 |  |  |  |  |  |  |  |  |  |  |  |  |  |  |  |  |  |  |  |  |  |  |  |  |  |  |  |  |  |  |  |  |  |  |  |  |  |  |  |  |  |  |  |  |  |  |  |  |  |  |
| Jan-14 | 12.3 |  |  |  |  |  |  |  |  |  |  |  |  |  |  |  |  |  |  |  |  |  |  |  |  |  |  |  |  |  |  |  |  |  |  |  |  |  |  |  |  |  |  |  |  |  |  |  |  |  |  |
| Feb-14 | 12.8 |  |  |  |  |  |  |  |  |  |  |  |  |  |  |  |  |  |  |  |  |  |  |  |  |  |  |  |  |  |  |  |  |  |  |  |  |  |  |  |  |  |  |  |  |  |  |  |  |  |  |
| Mar-14 | 11.3 |  |  |  |  |  |  |  |  |  |  |  |  |  |  |  |  |  |  |  |  |  |  |  |  |  |  |  |  |  |  |  |  |  |  |  |  |  |  |  |  |  |  |  |  |  |  |  |  |  |  |
| Apr-14 | 9.4 |  |  |  |  |  |  |  |  |  |  |  |  |  |  |  |  |  |  |  |  |  |  |  |  |  |  |  |  |  |  |  |  |  |  |  |  |  |  |  |  |  |  |  |  |  |  |  |  |  |  |
| May-14 | 8.6 |  |  |  |  |  |  |  |  |  |  |  |  |  |  |  |  |  |  |  |  |  |  |  |  |  |  |  |  |  |  |  |  |  |  |  |  |  |  |  |  |  |  |  |  |  |  |  |  |  |  |
| Jun-14 | 8.2 |  |  |  |  |  |  |  |  |  |  |  |  |  |  |  |  |  |  |  |  |  |  |  |  |  |  |  |  |  |  |  |  |  |  |  |  |  |  |  |  |  |  |  |  |  |  |  |  |  |  |
| Jul-14 | 7.5 |  |  |  |  |  |  |  |  |  |  |  |  |  |  |  |  |  |  |  |  |  |  |  |  |  |  |  |  |  |  |  |  |  |  |  |  |  |  |  |  |  |  |  |  |  |  |  |  |  |  |
| Aug-14 | 7.7 |  |  |  |  |  |  |  |  |  |  |  |  |  |  |  |  |  |  |  |  |  |  |  |  |  |  |  |  |  |  |  |  |  |  |  |  |  |  |  |  |  |  |  |  |  |  |  |  |  |  |
| Sep-14 | 7 |  |  |  |  |  |  |  |  |  |  |  |  |  |  |  |  |  |  |  |  |  |  |  |  |  |  |  |  |  |  |  |  |  |  |  |  |  |  |  |  |  |  |  |  |  |  |  |  |  |  |
| Oct-14 | 6.4 |  |  |  |  |  |  |  |  |  |  |  |  |  |  |  |  |  |  |  |  |  |  |  |  |  |  |  |  |  |  |  |  |  |  |  |  |  |  |  |  |  |  |  |  |  |  |  |  |  |  |
| Nov-14 | 7.5 |  |  |  |  |  |  |  |  |  |  |  |  |  |  |  |  |  |  |  |  |  |  |  |  |  |  |  |  |  |  |  |  |  |  |  |  |  |  |  |  |  |  |  |  |  |  |  |  |  |  |
| Dec-14 | 8.3 |  |  |  |  |  |  |  |  |  |  |  |  |  |  |  |  |  |  |  |  |  |  |  |  |  |  |  |  |  |  |  |  |  |  |  |  |  |  |  |  |  |  |  |  |  |  |  |  |  |  |
| Jan-15 | 9.8 |  |  |  |  |  |  |  |  |  |  |  |  |  |  |  |  |  |  |  |  |  |  |  |  |  |  |  |  |  |  |  |  |  |  |  |  |  |  |  |  |  |  |  |  |  |  |  |  |  |  |
| Feb-15 | 10.6 |  |  |  |  |  |  |  |  |  |  |  |  |  |  |  |  |  |  |  |  |  |  |  |  |  |  |  |  |  |  |  |  |  |  |  |  |  |  |  |  |  |  |  |  |  |  |  |  |  |  |
| Mar-15 | 9.5 |  |  |  |  |  |  |  |  |  |  |  |  |  |  |  |  |  |  |  |  |  |  |  |  |  |  |  |  |  |  |  |  |  |  |  |  |  |  |  |  |  |  |  |  |  |  |  |  |  |  |
| Apr-15 | 7.5 |  |  |  |  |  |  |  |  |  |  |  |  |  |  |  |  |  |  |  |  |  |  |  |  |  |  |  |  |  |  |  |  |  |  |  |  |  |  |  |  |  |  |  |  |  |  |  |  |  |  |
| May-15 | 6.7 |  |  |  |  |  |  |  |  |  |  |  |  |  |  |  |  |  |  |  |  |  |  |  |  |  |  |  |  |  |  |  |  |  |  |  |  |  |  |  |  |  |  |  |  |  |  |  |  |  |  |
| Jun-15 | 6.3 |  |  |  |  |  |  |  |  |  |  |  |  |  |  |  |  |  |  |  |  |  |  |  |  |  |  |  |  |  |  |  |  |  |  |  |  |  |  |  |  |  |  |  |  |  |  |  |  |  |  |
| Jul-15 | 5.5 |  |  |  |  |  |  |  |  |  |  |  |  |  |  |  |  |  |  |  |  |  |  |  |  |  |  |  |  |  |  |  |  |  |  |  |  |  |  |  |  |  |  |  |  |  |  |  |  |  |  |
| Aug-15 | 6.1 |  |  |  |  |  |  |  |  |  |  |  |  |  |  |  |  |  |  |  |  |  |  |  |  |  |  |  |  |  |  |  |  |  |  |  |  |  |  |  |  |  |  |  |  |  |  |  |  |  |  |
| Sep-15 | 5.5 |  |  |  |  |  |  |  |  |  |  |  |  |  |  |  |  |  |  |  |  |  |  |  |  |  |  |  |  |  |  |  |  |  |  |  |  |  |  |  |  |  |  |  |  |  |  |  |  |  |  |
| Oct-15 | 6.2 |  |  |  |  |  |  |  |  |  |  |  |  |  |  |  |  |  |  |  |  |  |  |  |  |  |  |  |  |  |  |  |  |  |  |  |  |  |  |  |  |  |  |  |  |  |  |  |  |  |  |
| Nov-15 | 6.2 |  |  |  |  |  |  |  |  |  |  |  |  |  |  |  |  |  |  |  |  |  |  |  |  |  |  |  |  |  |  |  |  |  |  |  |  |  |  |  |  |  |  |  |  |  |  |  |  |  |  |
| Dec-15 | 7.5 |  |  |  |  |  |  |  |  |  |  |  |  |  |  |  |  |  |  |  |  |  |  |  |  |  |  |  |  |  |  |  |  |  |  |  |  |  |  |  |  |  |  |  |  |  |  |  |  |  |  |
| Jan-16 | 8.5 |  |  |  |  |  |  |  |  |  |  |  |  |  |  |  |  |  |  |  |  |  |  |  |  |  |  |  |  |  |  |  |  |  |  |  |  |  |  |  |  |  |  |  |  |  |  |  |  |  |  |
| Feb-16 | 8.7 |  |  |  |  |  |  |  |  |  |  |  |  |  |  |  |  |  |  |  |  |  |  |  |  |  |  |  |  |  |  |  |  |  |  |  |  |  |  |  |  |  |  |  |  |  |  |  |  |  |  |
| Mar-16 | 8.7 |  |  |  |  |  |  |  |  |  |  |  |  |  |  |  |  |  |  |  |  |  |  |  |  |  |  |  |  |  |  |  |  |  |  |  |  |  |  |  |  |  |  |  |  |  |  |  |  |  |  |
| Apr-16 | 6 |  |  |  |  |  |  |  |  |  |  |  |  |  |  |  |  |  |  |  |  |  |  |  |  |  |  |  |  |  |  |  |  |  |  |  |  |  |  |  |  |  |  |  |  |  |  |  |  |  |  |
| May-16 | 5.2 |  |  |  |  |  |  |  |  |  |  |  |  |  |  |  |  |  |  |  |  |  |  |  |  |  |  |  |  |  |  |  |  |  |  |  |  |  |  |  |  |  |  |  |  |  |  |  |  |  |  |
| Jun-16 | 4.6 |  |  |  |  |  |  |  |  |  |  |  |  |  |  |  |  |  |  |  |  |  |  |  |  |  |  |  |  |  |  |  |  |  |  |  |  |  |  |  |  |  |  |  |  |  |  |  |  |  |  |
| Jul-16 | 4.5 |  |  |  |  |  |  |  |  |  |  |  |  |  |  |  |  |  |  |  |  |  |  |  |  |  |  |  |  |  |  |  |  |  |  |  |  |  |  |  |  |  |  |  |  |  |  |  |  |  |  |
| Aug-16 | 5.1 |  |  |  |  |  |  |  |  |  |  |  |  |  |  |  |  |  |  |  |  |  |  |  |  |  |  |  |  |  |  |  |  |  |  |  |  |  |  |  |  |  |  |  |  |  |  |  |  |  |  |
| Sep-16 | 5.2 |  |  |  |  |  |  |  |  |  |  |  |  |  |  |  |  |  |  |  |  |  |  |  |  |  |  |  |  |  |  |  |  |  |  |  |  |  |  |  |  |  |  |  |  |  |  |  |  |  |  |
| Oct-16 | 5.7 |  |  |  |  |  |  |  |  |  |  |  |  |  |  |  |  |  |  |  |  |  |  |  |  |  |  |  |  |  |  |  |  |  |  |  |  |  |  |  |  |  |  |  |  |  |  |  |  |  |  |
| Nov-16 | 5.7 |  |  |  |  |  |  |  |  |  |  |  |  |  |  |  |  |  |  |  |  |  |  |  |  |  |  |  |  |  |  |  |  |  |  |  |  |  |  |  |  |  |  |  |  |  |  |  |  |  |  |
| Dec-16 | 7.4 |  |  |  |  |  |  |  |  |  |  |  |  |  |  |  |  |  |  |  |  |  |  |  |  |  |  |  |  |  |  |  |  |  |  |  |  |  |  |  |  |  |  |  |  |  |  |  |  |  |  |
| Jan-17 | 9.4 |  |  |  |  |  |  |  |  |  |  |  |  |  |  |  |  |  |  |  |  |  |  |  |  |  |  |  |  |  |  |  |  |  |  |  |  |  |  |  |  |  |  |  |  |  |  |  |  |  |  |
| Feb-17 | 8.8 |  |  |  |  |  |  |  |  |  |  |  |  |  |  |  |  |  |  |  |  |  |  |  |  |  |  |  |  |  |  |  |  |  |  |  |  |  |  |  |  |  |  |  |  |  |  |  |  |  |  |
| Mar-17 | 8.4 |  |  |  |  |  |  |  |  |  |  |  |  |  |  |  |  |  |  |  |  |  |  |  |  |  |  |  |  |  |  |  |  |  |  |  |  |  |  |  |  |  |  |  |  |  |  |  |  |  |  |
| Apr-17 | 6.3 |  |  |  |  |  |  |  |  |  |  |  |  |  |  |  |  |  |  |  |  |  |  |  |  |  |  |  |  |  |  |  |  |  |  |  |  |  |  |  |  |  |  |  |  |  |  |  |  |  |  |
| May-17 | 5.3 |  |  |  |  |  |  |  |  |  |  |  |  |  |  |  |  |  |  |  |  |  |  |  |  |  |  |  |  |  |  |  |  |  |  |  |  |  |  |  |  |  |  |  |  |  |  |  |  |  |  |
| Jun-17 | 4.5 |  |  |  |  |  |  |  |  |  |  |  |  |  |  |  |  |  |  |  |  |  |  |  |  |  |  |  |  |  |  |  |  |  |  |  |  |  |  |  |  |  |  |  |  |  |  |  |  |  |  |
| Jul-17 | 4.9 |  |  |  |  |  |  |  |  |  |  |  |  |  |  |  |  |  |  |  |  |  |  |  |  |  |  |  |  |  |  |  |  |  |  |  |  |  |  |  |  |  |  |  |  |  |  |  |  |  |  |
| Aug-17 | 4.7 |  |  |  |  |  |  |  |  |  |  |  |  |  |  |  |  |  |  |  |  |  |  |  |  |  |  |  |  |  |  |  |  |  |  |  |  |  |  |  |  |  |  |  |  |  |  |  |  |  |  |
| Sep-17 | 4.7 |  |  |  |  |  |  |  |  |  |  |  |  |  |  |  |  |  |  |  |  |  |  |  |  |  |  |  |  |  |  |  |  |  |  |  |  |  |  |  |  |  |  |  |  |  |  |  |  |  |  |
| Oct-17 | 4.5 |  |  |  |  |  |  |  |  |  |  |  |  |  |  |  |  |  |  |  |  |  |  |  |  |  |  |  |  |  |  |  |  |  |  |  |  |  |  |  |  |  |  |  |  |  |  |  |  |  |  |
| Nov-17 | 5 |  |  |  |  |  |  |  |  |  |  |  |  |  |  |  |  |  |  |  |  |  |  |  |  |  |  |  |  |  |  |  |  |  |  |  |  |  |  |  |  |  |  |  |  |  |  |  |  |  |  |
| Dec-17 | 5.9 |  |  |  |  |  |  |  |  |  |  |  |  |  |  |  |  |  |  |  |  |  |  |  |  |  |  |  |  |  |  |  |  |  |  |  |  |  |  |  |  |  |  |  |  |  |  |  |  |  |  |
| Jan-18 | 7.3 |  |  |  |  |  |  |  |  |  |  |  |  |  |  |  |  |  |  |  |  |  |  |  |  |  |  |  |  |  |  |  |  |  |  |  |  |  |  |  |  |  |  |  |  |  |  |  |  |  |  |
| Feb-18 | 7.8 |  |  |  |  |  |  |  |  |  |  |  |  |  |  |  |  |  |  |  |  |  |  |  |  |  |  |  |  |  |  |  |  |  |  |  |  |  |  |  |  |  |  |  |  |  |  |  |  |  |  |
| Mar-18 | 7.4 |  |  |  |  |  |  |  |  |  |  |  |  |  |  |  |  |  |  |  |  |  |  |  |  |  |  |  |  |  |  |  |  |  |  |  |  |  |  |  |  |  |  |  |  |  |  |  |  |  |  |
| Apr-18 | 6.5 |  |  |  |  |  |  |  |  |  |  |  |  |  |  |  |  |  |  |  |  |  |  |  |  |  |  |  |  |  |  |  |  |  |  |  |  |  |  |  |  |  |  |  |  |  |  |  |  |  |  |
| May-18 | 4.4 |  |  |  |  |  |  |  |  |  |  |  |  |  |  |  |  |  |  |  |  |  |  |  |  |  |  |  |  |  |  |  |  |  |  |  |  |  |  |  |  |  |  |  |  |  |  |  |  |  |  |
| Jun-18 | 4.7 |  |  |  |  |  |  |  |  |  |  |  |  |  |  |  |  |  |  |  |  |  |  |  |  |  |  |  |  |  |  |  |  |  |  |  |  |  |  |  |  |  |  |  |  |  |  |  |  |  |  |
| Jul-18 | 3.4 |  |  |  |  |  |  |  |  |  |  |  |  |  |  |  |  |  |  |  |  |  |  |  |  |  |  |  |  |  |  |  |  |  |  |  |  |  |  |  |  |  |  |  |  |  |  |  |  |  |  |
| Aug-18 | 3.4 |  |  |  |  |  |  |  |  |  |  |  |  |  |  |  |  |  |  |  |  |  |  |  |  |  |  |  |  |  |  |  |  |  |  |  |  |  |  |  |  |  |  |  |  |  |  |  |  |  |  |
| Sep-18 | 4.1 |  |  |  |  |  |  |  |  |  |  |  |  |  |  |  |  |  |  |  |  |  |  |  |  |  |  |  |  |  |  |  |  |  |  |  |  |  |  |  |  |  |  |  |  |  |  |  |  |  |  |
| Oct-18 | 3.6 |  |  |  |  |  |  |  |  |  |  |  |  |  |  |  |  |  |  |  |  |  |  |  |  |  |  |  |  |  |  |  |  |  |  |  |  |  |  |  |  |  |  |  |  |  |  |  |  |  |  |
| Nov-18 | 3.9 |  |  |  |  |  |  |  |  |  |  |  |  |  |  |  |  |  |  |  |  |  |  |  |  |  |  |  |  |  |  |  |  |  |  |  |  |  |  |  |  |  |  |  |  |  |  |  |  |  |  |
| Dec-18 | 5.1 |  |  |  |  |  |  |  |  |  |  |  |  |  |  |  |  |  |  |  |  |  |  |  |  |  |  |  |  |  |  |  |  |  |  |  |  |  |  |  |  |  |  |  |  |  |  |  |  |  |  |
| Jan-19 | 6.4 |  |  |  |  |  |  |  |  |  |  |  |  |  |  |  |  |  |  |  |  |  |  |  |  |  |  |  |  |  |  |  |  |  |  |  |  |  |  |  |  |  |  |  |  |  |  |  |  |  |  |
| Feb-19 | 6.2 |  |  |  |  |  |  |  |  |  |  |  |  |  |  |  |  |  |  |  |  |  |  |  |  |  |  |  |  |  |  |  |  |  |  |  |  |  |  |  |  |  |  |  |  |  |  |  |  |  |  |
| Mar-19 | 5.2 |  |  |  |  |  |  |  |  |  |  |  |  |  |  |  |  |  |  |  |  |  |  |  |  |  |  |  |  |  |  |  |  |  |  |  |  |  |  |  |  |  |  |  |  |  |  |  |  |  |  |
| Apr-19 | 4.7 |  |  |  |  |  |  |  |  |  |  |  |  |  |  |  |  |  |  |  |  |  |  |  |  |  |  |  |  |  |  |  |  |  |  |  |  |  |  |  |  |  |  |  |  |  |  |  |  |  |  |
| May-19 | 3.2 |  |  |  |  |  |  |  |  |  |  |  |  |  |  |  |  |  |  |  |  |  |  |  |  |  |  |  |  |  |  |  |  |  |  |  |  |  |  |  |  |  |  |  |  |  |  |  |  |  |  |
| Jun-19 | 4 |  |  |  |  |  |  |  |  |  |  |  |  |  |  |  |  |  |  |  |  |  |  |  |  |  |  |  |  |  |  |  |  |  |  |  |  |  |  |  |  |  |  |  |  |  |  |  |  |  |  |
| Jul-19 | 3.8 |  |  |  |  |  |  |  |  |  |  |  |  |  |  |  |  |  |  |  |  |  |  |  |  |  |  |  |  |  |  |  |  |  |  |  |  |  |  |  |  |  |  |  |  |  |  |  |  |  |  |
| Aug-19 | 3.6 |  |  |  |  |  |  |  |  |  |  |  |  |  |  |  |  |  |  |  |  |  |  |  |  |  |  |  |  |  |  |  |  |  |  |  |  |  |  |  |  |  |  |  |  |  |  |  |  |  |  |
| Sep-19 | 3.2 |  |  |  |  |  |  |  |  |  |  |  |  |  |  |  |  |  |  |  |  |  |  |  |  |  |  |  |  |  |  |  |  |  |  |  |  |  |  |  |  |  |  |  |  |  |  |  |  |  |  |
| Oct-19 | 4 |  |  |  |  |  |  |  |  |  |  |  |  |  |  |  |  |  |  |  |  |  |  |  |  |  |  |  |  |  |  |  |  |  |  |  |  |  |  |  |  |  |  |  |  |  |  |  |  |  |  |
| Nov-19 | 4.4 |  |  |  |  |  |  |  |  |  |  |  |  |  |  |  |  |  |  |  |  |  |  |  |  |  |  |  |  |  |  |  |  |  |  |  |  |  |  |  |  |  |  |  |  |  |  |  |  |  |  |
| Dec-19 | 5 |  |  |  |  |  |  |  |  |  |  |  |  |  |  |  |  |  |  |  |  |  |  |  |  |  |  |  |  |  |  |  |  |  |  |  |  |  |  |  |  |  |  |  |  |  |  |  |  |  |  |
| Jan-20 | 5.4 |  |  |  |  |  |  |  |  |  |  |  |  |  |  |  |  |  |  |  |  |  |  |  |  |  |  |  |  |  |  |  |  |  |  |  |  |  |  |  |  |  |  |  |  |  |  |  |  |  |  |
| Feb-20 | 5.5 |  |  |  |  |  |  |  |  |  |  |  |  |  |  |  |  |  |  |  |  |  |  |  |  |  |  |  |  |  |  |  |  |  |  |  |  |  |  |  |  |  |  |  |  |  |  |  |  |  |  |
| Mar-20 | 6.9 |  |  |  |  |  |  |  |  |  |  |  |  |  |  |  |  |  |  |  |  |  |  |  |  |  |  |  |  |  |  |  |  |  |  |  |  |  |  |  |  |  |  |  |  |  |  |  |  |  |  |
| Apr-20 | 16.6 |  |  |  |  |  |  |  |  |  |  |  |  |  |  |  |  |  |  |  |  |  |  |  |  |  |  |  |  |  |  |  |  |  |  |  |  |  |  |  |  |  |  |  |  |  |  |  |  |  |  |
| May-20 | 12.7 |  |  |  |  |  |  |  |  |  |  |  |  |  |  |  |  |  |  |  |  |  |  |  |  |  |  |  |  |  |  |  |  |  |  |  |  |  |  |  |  |  |  |  |  |  |  |  |  |  |  |
| Jun-20 | 10.1 |  |  |  |  |  |  |  |  |  |  |  |  |  |  |  |  |  |  |  |  |  |  |  |  |  |  |  |  |  |  |  |  |  |  |  |  |  |  |  |  |  |  |  |  |  |  |  |  |  |  |
| Jul-20 | 8.9 |  |  |  |  |  |  |  |  |  |  |  |  |  |  |  |  |  |  |  |  |  |  |  |  |  |  |  |  |  |  |  |  |  |  |  |  |  |  |  |  |  |  |  |  |  |  |  |  |  |  |
| Aug-20 | 7.6 |  |  |  |  |  |  |  |  |  |  |  |  |  |  |  |  |  |  |  |  |  |  |  |  |  |  |  |  |  |  |  |  |  |  |  |  |  |  |  |  |  |  |  |  |  |  |  |  |  |  |
| Sep-20 | 7.1 |  |  |  |  |  |  |  |  |  |  |  |  |  |  |  |  |  |  |  |  |  |  |  |  |  |  |  |  |  |  |  |  |  |  |  |  |  |  |  |  |  |  |  |  |  |  |  |  |  |  |
| Oct-20 | 6.8 |  |  |  |  |  |  |  |  |  |  |  |  |  |  |  |  |  |  |  |  |  |  |  |  |  |  |  |  |  |  |  |  |  |  |  |  |  |  |  |  |  |  |  |  |  |  |  |  |  |  |
| Nov-20 | 7.3 |  |  |  |  |  |  |  |  |  |  |  |  |  |  |  |  |  |  |  |  |  |  |  |  |  |  |  |  |  |  |  |  |  |  |  |  |  |  |  |  |  |  |  |  |  |  |  |  |  |  |
| Dec-20 | 9.6 |  |  |  |  |  |  |  |  |  |  |  |  |  |  |  |  |  |  |  |  |  |  |  |  |  |  |  |  |  |  |  |  |  |  |  |  |  |  |  |  |  |  |  |  |  |  |  |  |  |  |
| Jan-21 | 9.4 |  |  |  |  |  |  |  |  |  |  |  |  |  |  |  |  |  |  |  |  |  |  |  |  |  |  |  |  |  |  |  |  |  |  |  |  |  |  |  |  |  |  |  |  |  |  |  |  |  |  |
| Feb-21 | 9.6 |  |  |  |  |  |  |  |  |  |  |  |  |  |  |  |  |  |  |  |  |  |  |  |  |  |  |  |  |  |  |  |  |  |  |  |  |  |  |  |  |  |  |  |  |  |  |  |  |  |  |
| Mar-21 | 8.6 |  |  |  |  |  |  |  |  |  |  |  |  |  |  |  |  |  |  |  |  |  |  |  |  |  |  |  |  |  |  |  |  |  |  |  |  |  |  |  |  |  |  |  |  |  |  |  |  |  |  |
| Apr-21 | 7.7 |  |  |  |  |  |  |  |  |  |  |  |  |  |  |  |  |  |  |  |  |  |  |  |  |  |  |  |  |  |  |  |  |  |  |  |  |  |  |  |  |  |  |  |  |  |  |  |  |  |  |
| May-21 | 6.7 |  |  |  |  |  |  |  |  |  |  |  |  |  |  |  |  |  |  |  |  |  |  |  |  |  |  |  |  |  |  |  |  |  |  |  |  |  |  |  |  |  |  |  |  |  |  |  |  |  |  |
| Jun-21 | 7.5 |  |  |  |  |  |  |  |  |  |  |  |  |  |  |  |  |  |  |  |  |  |  |  |  |  |  |  |  |  |  |  |  |  |  |  |  |  |  |  |  |  |  |  |  |  |  |  |  |  |  |
| Jul-21 | 6.1 |  |  |  |  |  |  |  |  |  |  |  |  |  |  |  |  |  |  |  |  |  |  |  |  |  |  |  |  |  |  |  |  |  |  |  |  |  |  |  |  |  |  |  |  |  |  |  |  |  |  |
| Aug-21 | 4.6 |  |  |  |  |  |  |  |  |  |  |  |  |  |  |  |  |  |  |  |  |  |  |  |  |  |  |  |  |  |  |  |  |  |  |  |  |  |  |  |  |  |  |  |  |  |  |  |  |  |  |
| Sep-21 | 4.5 |  |  |  |  |  |  |  |  |  |  |  |  |  |  |  |  |  |  |  |  |  |  |  |  |  |  |  |  |  |  |  |  |  |  |  |  |  |  |  |  |  |  |  |  |  |  |  |  |  |  |
| Oct-21 | 4 |  |  |  |  |  |  |  |  |  |  |  |  |  |  |  |  |  |  |  |  |  |  |  |  |  |  |  |  |  |  |  |  |  |  |  |  |  |  |  |  |  |  |  |  |  |  |  |  |  |  |
| Nov-21 | 4.7 |  |  |  |  |  |  |  |  |  |  |  |  |  |  |  |  |  |  |  |  |  |  |  |  |  |  |  |  |  |  |  |  |  |  |  |  |  |  |  |  |  |  |  |  |  |  |  |  |  |  |
| Dec-21 | 5 |  |  |  |  |  |  |  |  |  |  |  |  |  |  |  |  |  |  |  |  |  |  |  |  |  |  |  |  |  |  |  |  |  |  |  |  |  |  |  |  |  |  |  |  |  |  |  |  |  |  |
| Jan-22 | 7.1 |  |  |  |  |  |  |  |  |  |  |  |  |  |  |  |  |  |  |  |  |  |  |  |  |  |  |  |  |  |  |  |  |  |  |  |  |  |  |  |  |  |  |  |  |  |  |  |  |  |  |
| Feb-22 | 6.7 |  |  |  |  |  |  |  |  |  |  |  |  |  |  |  |  |  |  |  |  |  |  |  |  |  |  |  |  |  |  |  |  |  |  |  |  |  |  |  |  |  |  |  |  |  |  |  |  |  |  |
| Mar-22 | 6 |  |  |  |  |  |  |  |  |  |  |  |  |  |  |  |  |  |  |  |  |  |  |  |  |  |  |  |  |  |  |  |  |  |  |  |  |  |  |  |  |  |  |  |  |  |  |  |  |  |  |
| Apr-22 | 4.6 |  |  |  |  |  |  |  |  |  |  |  |  |  |  |  |  |  |  |  |  |  |  |  |  |  |  |  |  |  |  |  |  |  |  |  |  |  |  |  |  |  |  |  |  |  |  |  |  |  |  |
| May-22 | 3.8 |  |  |  |  |  |  |  |  |  |  |  |  |  |  |  |  |  |  |  |  |  |  |  |  |  |  |  |  |  |  |  |  |  |  |  |  |  |  |  |  |  |  |  |  |  |  |  |  |  |  |
| Jun-22 | 3.7 |  |  |  |  |  |  |  |  |  |  |  |  |  |  |  |  |  |  |  |  |  |  |  |  |  |  |  |  |  |  |  |  |  |  |  |  |  |  |  |  |  |  |  |  |  |  |  |  |  |  |
| Jul-22 | 3.5 |  |  |  |  |  |  |  |  |  |  |  |  |  |  |  |  |  |  |  |  |  |  |  |  |  |  |  |  |  |  |  |  |  |  |  |  |  |  |  |  |  |  |  |  |  |  |  |  |  |  |
| Aug-22 | 3.9 |  |  |  |  |  |  |  |  |  |  |  |  |  |  |  |  |  |  |  |  |  |  |  |  |  |  |  |  |  |  |  |  |  |  |  |  |  |  |  |  |  |  |  |  |  |  |  |  |  |  |
| Sep-22 | 3.4 |  |  |  |  |  |  |  |  |  |  |  |  |  |  |  |  |  |  |  |  |  |  |  |  |  |  |  |  |  |  |  |  |  |  |  |  |  |  |  |  |  |  |  |  |  |  |  |  |  |  |
| Oct-22 | 4.1 |  |  |  |  |  |  |  |  |  |  |  |  |  |  |  |  |  |  |  |  |  |  |  |  |  |  |  |  |  |  |  |  |  |  |  |  |  |  |  |  |  |  |  |  |  |  |  |  |  |  |
| Nov-22 | 3.9 |  |  |  |  |  |  |  |  |  |  |  |  |  |  |  |  |  |  |  |  |  |  |  |  |  |  |  |  |  |  |  |  |  |  |  |  |  |  |  |  |  |  |  |  |  |  |  |  |  |  |
| Dec-22 | 4.4 |  |  |  |  |  |  |  |  |  |  |  |  |  |  |  |  |  |  |  |  |  |  |  |  |  |  |  |  |  |  |  |  |  |  |  |  |  |  |  |  |  |  |  |  |  |  |  |  |  |  |
| Jan-23 | 6.9 |  |  |  |  |  |  |  |  |  |  |  |  |  |  |  |  |  |  |  |  |  |  |  |  |  |  |  |  |  |  |  |  |  |  |  |  |  |  |  |  |  |  |  |  |  |  |  |  |  |  |
| Feb-23 | 6.6 |  |  |  |  |  |  |  |  |  |  |  |  |  |  |  |  |  |  |  |  |  |  |  |  |  |  |  |  |  |  |  |  |  |  |  |  |  |  |  |  |  |  |  |  |  |  |  |  |  |  |
| Mar-23 | 5.6 |  |  |  |  |  |  |  |  |  |  |  |  |  |  |  |  |  |  |  |  |  |  |  |  |  |  |  |  |  |  |  |  |  |  |  |  |  |  |  |  |  |  |  |  |  |  |  |  |  |  |
| Apr-23 | 4.1 |  |  |  |  |  |  |  |  |  |  |  |  |  |  |  |  |  |  |  |  |  |  |  |  |  |  |  |  |  |  |  |  |  |  |  |  |  |  |  |  |  |  |  |  |  |  |  |  |  |  |
| May-23 | 3.5 |  |  |  |  |  |  |  |  |  |  |  |  |  |  |  |  |  |  |  |  |  |  |  |  |  |  |  |  |  |  |  |  |  |  |  |  |  |  |  |  |  |  |  |  |  |  |  |  |  |  |
| Jun-23 | 3.6 |  |  |  |  |  |  |  |  |  |  |  |  |  |  |  |  |  |  |  |  |  |  |  |  |  |  |  |  |  |  |  |  |  |  |  |  |  |  |  |  |  |  |  |  |  |  |  |  |  |  |
| Jul-23 | 3.9 |  |  |  |  |  |  |  |  |  |  |  |  |  |  |  |  |  |  |  |  |  |  |  |  |  |  |  |  |  |  |  |  |  |  |  |  |  |  |  |  |  |  |  |  |  |  |  |  |  |  |
| Aug-23 | 3.9 |  |  |  |  |  |  |  |  |  |  |  |  |  |  |  |  |  |  |  |  |  |  |  |  |  |  |  |  |  |  |  |  |  |  |  |  |  |  |  |  |  |  |  |  |  |  |  |  |  |  |
| Sep-23 | 3.8 |  |  |  |  |  |  |  |  |  |  |  |  |  |  |  |  |  |  |  |  |  |  |  |  |  |  |  |  |  |  |  |  |  |  |  |  |  |  |  |  |  |  |  |  |  |  |  |  |  |  |
| Oct-23 | 4 |  |  |  |  |  |  |  |  |  |  |  |  |  |  |  |  |  |  |  |  |  |  |  |  |  |  |  |  |  |  |  |  |  |  |  |  |  |  |  |  |  |  |  |  |  |  |  |  |  |  |
| Nov-23 | 4.8 |  |  |  |  |  |  |  |  |  |  |  |  |  |  |  |  |  |  |  |  |  |  |  |  |  |  |  |  |  |  |  |  |  |  |  |  |  |  |  |  |  |  |  |  |  |  |  |  |  |  |
| Dec-23 | 4.4 |  |  |  |  |  |  |  |  |  |  |  |  |  |  |  |  |  |  |  |  |  |  |  |  |  |  |  |  |  |  |  |  |  |  |  |  |  |  |  |  |  |  |  |  |  |  |  |  |  |  |
| Jan-24 | 6.9 |  |  |  |  |  |  |  |  |  |  |  |  |  |  |  |  |  |  |  |  |  |  |  |  |  |  |  |  |  |  |  |  |  |  |  |  |  |  |  |  |  |  |  |  |  |  |  |  |  |  |
| Feb-24 | 7 |  |  |  |  |  |  |  |  |  |  |  |  |  |  |  |  |  |  |  |  |  |  |  |  |  |  |  |  |  |  |  |  |  |  |  |  |  |  |  |  |  |  |  |  |  |  |  |  |  |  |
| Mar-24 | 5.4 |  |  |  |  |  |  |  |  |  |  |  |  |  |  |  |  |  |  |  |  |  |  |  |  |  |  |  |  |  |  |  |  |  |  |  |  |  |  |  |  |  |  |  |  |  |  |  |  |  |  |